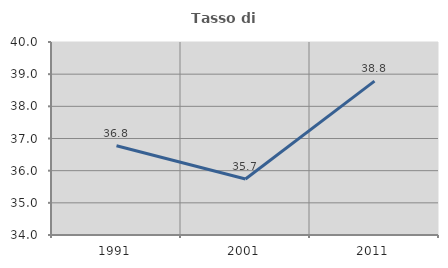
| Category | Tasso di occupazione   |
|---|---|
| 1991.0 | 36.775 |
| 2001.0 | 35.743 |
| 2011.0 | 38.782 |